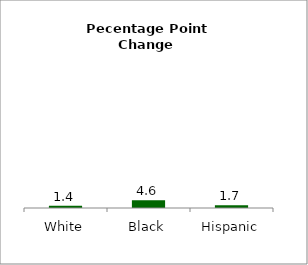
| Category | Series 0 |
|---|---|
| White | 1.372 |
| Black | 4.573 |
| Hispanic | 1.679 |